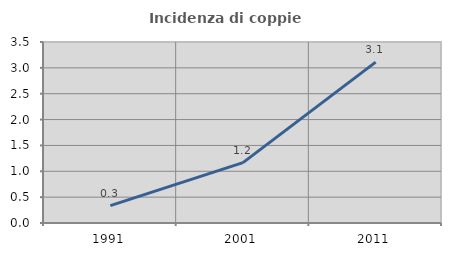
| Category | Incidenza di coppie miste |
|---|---|
| 1991.0 | 0.337 |
| 2001.0 | 1.166 |
| 2011.0 | 3.112 |